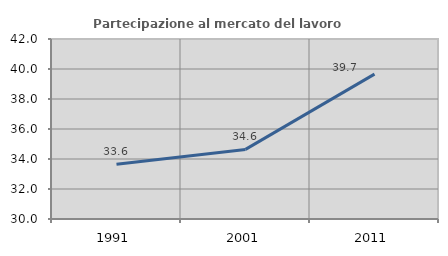
| Category | Partecipazione al mercato del lavoro  femminile |
|---|---|
| 1991.0 | 33.644 |
| 2001.0 | 34.639 |
| 2011.0 | 39.659 |